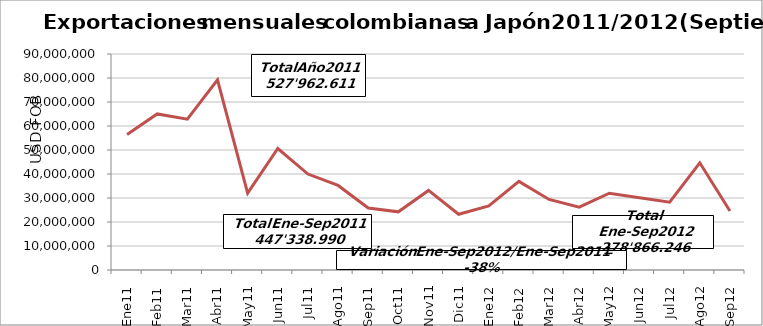
| Category | Series 0 |
|---|---|
| 0 | 56458396.97 |
| 1 | 65041905.47 |
| 2 | 62867943.91 |
| 3 | 79261660.75 |
| 4 | 32017507.54 |
| 5 | 50622269.95 |
| 6 | 39985633.02 |
| 7 | 35233589.57 |
| 8 | 25850082.97 |
| 9 | 24241766.15 |
| 10 | 33147691.52 |
| 11 | 23234163.64 |
| 12 | 26725964.49 |
| 13 | 36922898 |
| 14 | 29409090.79 |
| 15 | 26195749.75 |
| 16 | 31997748.6 |
| 17 | 30129110.71 |
| 18 | 28241192.73 |
| 19 | 44659078.54 |
| 20 | 24585412.37 |